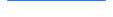
| Category | Series 0 |
|---|---|
| 0 | 33 |
| 1 | 45 |
| 2 | 32 |
| 3 | 29 |
| 4 | 35 |
| 5 | 25 |
| 6 | 33 |
| 7 | 25 |
| 8 | 26 |